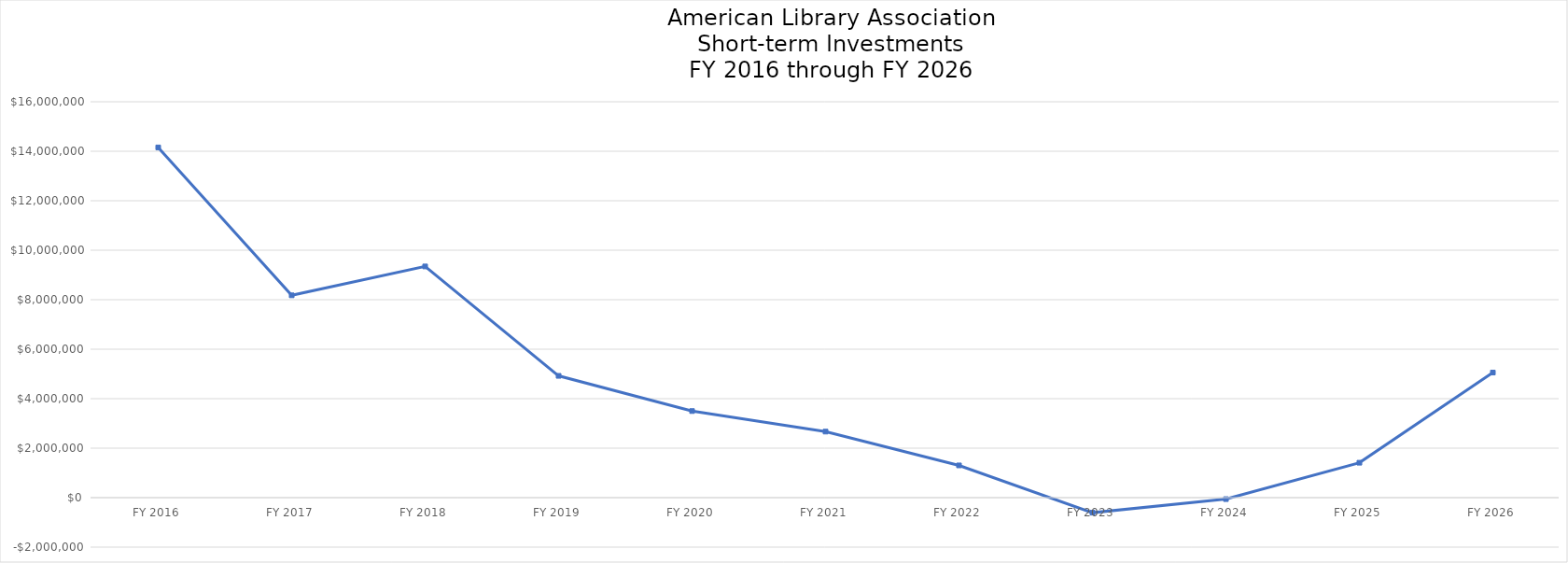
| Category | Short-term Investment Balance |
|---|---|
| FY 2016 | 14154503 |
| FY 2017 | 8177379 |
| FY 2018 | 9344249 |
| FY 2019 | 4922704 |
| FY 2020 | 3500000 |
| FY 2021 | 2669732.3 |
| FY 2022 | 1303137.714 |
| FY 2023 | -607920.888 |
| FY 2024 | -58780.181 |
| FY 2025 | 1411015.527 |
| FY 2026 | 5055273.512 |